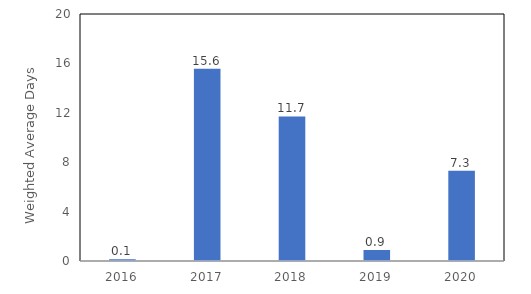
| Category | Series 0 |
|---|---|
| 2016.0 | 0.141 |
| 2017.0 | 15.559 |
| 2018.0 | 11.704 |
| 2019.0 | 0.892 |
| 2020.0 | 7.314 |